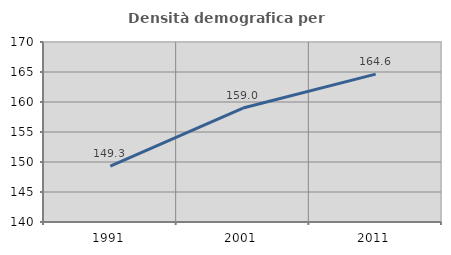
| Category | Densità demografica |
|---|---|
| 1991.0 | 149.322 |
| 2001.0 | 158.993 |
| 2011.0 | 164.648 |